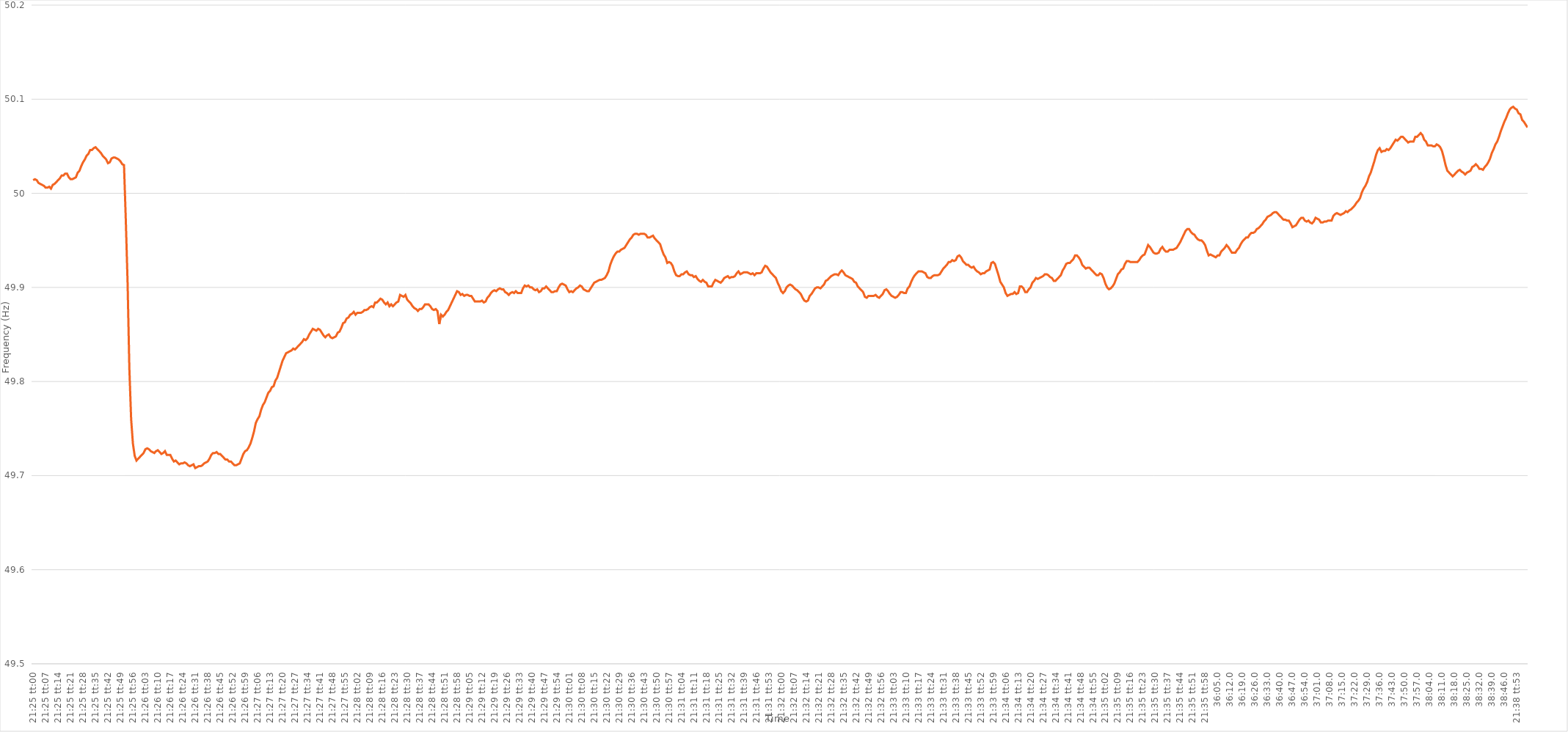
| Category | Series 0 |
|---|---|
| 0.8923611111111112 | 50.014 |
| 0.8923726851851851 | 50.015 |
| 0.8923842592592592 | 50.014 |
| 0.8923958333333334 | 50.011 |
| 0.8924074074074074 | 50.01 |
| 0.8924189814814815 | 50.009 |
| 0.8924305555555555 | 50.008 |
| 0.8924421296296297 | 50.006 |
| 0.8924537037037038 | 50.006 |
| 0.8924652777777777 | 50.007 |
| 0.8924768518518519 | 50.005 |
| 0.8924884259259259 | 50.009 |
| 0.8925000000000001 | 50.01 |
| 0.892511574074074 | 50.012 |
| 0.8925231481481481 | 50.014 |
| 0.8925347222222223 | 50.016 |
| 0.8925462962962962 | 50.019 |
| 0.8925578703703704 | 50.019 |
| 0.8925694444444444 | 50.021 |
| 0.8925810185185186 | 50.021 |
| 0.8925925925925925 | 50.017 |
| 0.8926041666666666 | 50.015 |
| 0.8926157407407408 | 50.015 |
| 0.8926273148148148 | 50.016 |
| 0.8926388888888889 | 50.017 |
| 0.8926504629629629 | 50.022 |
| 0.8926620370370371 | 50.024 |
| 0.8926736111111112 | 50.029 |
| 0.8926851851851851 | 50.033 |
| 0.8926967592592593 | 50.036 |
| 0.8927083333333333 | 50.04 |
| 0.8927199074074075 | 50.042 |
| 0.8927314814814814 | 50.046 |
| 0.8927430555555556 | 50.046 |
| 0.8927546296296297 | 50.048 |
| 0.8927662037037036 | 50.049 |
| 0.8927777777777778 | 50.047 |
| 0.8927893518518518 | 50.045 |
| 0.892800925925926 | 50.043 |
| 0.8928124999999999 | 50.04 |
| 0.892824074074074 | 50.038 |
| 0.8928356481481482 | 50.036 |
| 0.8928472222222222 | 50.032 |
| 0.8928587962962963 | 50.033 |
| 0.8928703703703703 | 50.037 |
| 0.8928819444444445 | 50.038 |
| 0.8928935185185186 | 50.038 |
| 0.8929050925925925 | 50.037 |
| 0.8929166666666667 | 50.036 |
| 0.8929282407407407 | 50.034 |
| 0.8929398148148149 | 50.031 |
| 0.8929513888888888 | 50.03 |
| 0.892962962962963 | 49.972 |
| 0.8929745370370371 | 49.906 |
| 0.892986111111111 | 49.814 |
| 0.8929976851851852 | 49.76 |
| 0.8930092592592592 | 49.734 |
| 0.8930208333333334 | 49.721 |
| 0.8930324074074073 | 49.716 |
| 0.8930439814814815 | 49.718 |
| 0.8930555555555556 | 49.72 |
| 0.8930671296296296 | 49.722 |
| 0.8930787037037037 | 49.724 |
| 0.8930902777777777 | 49.728 |
| 0.8931018518518519 | 49.729 |
| 0.893113425925926 | 49.728 |
| 0.893125 | 49.726 |
| 0.8931365740740741 | 49.725 |
| 0.8931481481481481 | 49.724 |
| 0.8931597222222223 | 49.726 |
| 0.8931712962962962 | 49.727 |
| 0.8931828703703704 | 49.725 |
| 0.8931944444444445 | 49.723 |
| 0.8932060185185186 | 49.724 |
| 0.8932175925925926 | 49.726 |
| 0.8932291666666666 | 49.722 |
| 0.8932407407407408 | 49.722 |
| 0.8932523148148147 | 49.722 |
| 0.8932638888888889 | 49.718 |
| 0.893275462962963 | 49.715 |
| 0.893287037037037 | 49.716 |
| 0.8932986111111111 | 49.714 |
| 0.8933101851851851 | 49.712 |
| 0.8933217592592593 | 49.713 |
| 0.8933333333333334 | 49.713 |
| 0.8933449074074074 | 49.714 |
| 0.8933564814814815 | 49.713 |
| 0.8933680555555555 | 49.711 |
| 0.8933796296296297 | 49.71 |
| 0.8933912037037036 | 49.711 |
| 0.8934027777777778 | 49.712 |
| 0.8934143518518519 | 49.708 |
| 0.893425925925926 | 49.709 |
| 0.8934375 | 49.71 |
| 0.893449074074074 | 49.71 |
| 0.8934606481481482 | 49.711 |
| 0.8934722222222223 | 49.713 |
| 0.8934837962962963 | 49.714 |
| 0.8934953703703704 | 49.715 |
| 0.8935069444444445 | 49.718 |
| 0.8935185185185185 | 49.722 |
| 0.8935300925925925 | 49.724 |
| 0.8935416666666667 | 49.724 |
| 0.8935532407407408 | 49.725 |
| 0.8935648148148148 | 49.723 |
| 0.8935763888888889 | 49.723 |
| 0.893587962962963 | 49.721 |
| 0.8935995370370371 | 49.719 |
| 0.893611111111111 | 49.717 |
| 0.8936226851851852 | 49.717 |
| 0.8936342592592593 | 49.715 |
| 0.8936458333333334 | 49.715 |
| 0.8936574074074074 | 49.713 |
| 0.8936689814814814 | 49.711 |
| 0.8936805555555556 | 49.711 |
| 0.8936921296296297 | 49.712 |
| 0.8937037037037037 | 49.713 |
| 0.8937152777777778 | 49.718 |
| 0.8937268518518519 | 49.723 |
| 0.8937384259259259 | 49.726 |
| 0.8937499999999999 | 49.727 |
| 0.8937615740740741 | 49.73 |
| 0.8937731481481482 | 49.734 |
| 0.8937847222222222 | 49.74 |
| 0.8937962962962963 | 49.747 |
| 0.8938078703703703 | 49.756 |
| 0.8938194444444445 | 49.76 |
| 0.8938310185185184 | 49.763 |
| 0.8938425925925926 | 49.77 |
| 0.8938541666666667 | 49.775 |
| 0.8938657407407408 | 49.778 |
| 0.8938773148148148 | 49.783 |
| 0.8938888888888888 | 49.788 |
| 0.893900462962963 | 49.79 |
| 0.8939120370370371 | 49.794 |
| 0.8939236111111111 | 49.795 |
| 0.8939351851851852 | 49.801 |
| 0.8939467592592593 | 49.804 |
| 0.8939583333333333 | 49.81 |
| 0.8939699074074073 | 49.816 |
| 0.8939814814814815 | 49.822 |
| 0.8939930555555556 | 49.826 |
| 0.8940046296296296 | 49.83 |
| 0.8940162037037037 | 49.831 |
| 0.8940277777777778 | 49.832 |
| 0.8940393518518519 | 49.833 |
| 0.8940509259259258 | 49.835 |
| 0.8940625 | 49.834 |
| 0.8940740740740741 | 49.836 |
| 0.8940856481481482 | 49.838 |
| 0.8940972222222222 | 49.84 |
| 0.8941087962962962 | 49.842 |
| 0.8941203703703704 | 49.845 |
| 0.8941319444444445 | 49.844 |
| 0.8941435185185185 | 49.846 |
| 0.8941550925925926 | 49.85 |
| 0.8941666666666667 | 49.853 |
| 0.8941782407407407 | 49.856 |
| 0.8941898148148147 | 49.855 |
| 0.8942013888888889 | 49.854 |
| 0.894212962962963 | 49.856 |
| 0.894224537037037 | 49.855 |
| 0.8942361111111111 | 49.852 |
| 0.8942476851851852 | 49.849 |
| 0.8942592592592593 | 49.847 |
| 0.8942708333333332 | 49.849 |
| 0.8942824074074074 | 49.85 |
| 0.8942939814814815 | 49.847 |
| 0.8943055555555556 | 49.846 |
| 0.8943171296296296 | 49.847 |
| 0.8943287037037037 | 49.848 |
| 0.8943402777777778 | 49.852 |
| 0.894351851851852 | 49.853 |
| 0.8943634259259259 | 49.857 |
| 0.894375 | 49.862 |
| 0.8943865740740741 | 49.863 |
| 0.8943981481481482 | 49.867 |
| 0.8944097222222221 | 49.868 |
| 0.8944212962962963 | 49.871 |
| 0.8944328703703704 | 49.872 |
| 0.8944444444444444 | 49.874 |
| 0.8944560185185185 | 49.871 |
| 0.8944675925925926 | 49.873 |
| 0.8944791666666667 | 49.873 |
| 0.8944907407407406 | 49.873 |
| 0.8945023148148148 | 49.874 |
| 0.8945138888888889 | 49.876 |
| 0.894525462962963 | 49.876 |
| 0.894537037037037 | 49.877 |
| 0.8945486111111111 | 49.879 |
| 0.8945601851851852 | 49.88 |
| 0.8945717592592594 | 49.879 |
| 0.8945833333333333 | 49.884 |
| 0.8945949074074074 | 49.884 |
| 0.8946064814814815 | 49.886 |
| 0.8946180555555556 | 49.888 |
| 0.8946296296296296 | 49.887 |
| 0.8946412037037037 | 49.884 |
| 0.8946527777777779 | 49.882 |
| 0.8946643518518518 | 49.884 |
| 0.8946759259259259 | 49.88 |
| 0.8946875 | 49.882 |
| 0.8946990740740741 | 49.88 |
| 0.894710648148148 | 49.882 |
| 0.8947222222222222 | 49.884 |
| 0.8947337962962963 | 49.885 |
| 0.8947453703703704 | 49.892 |
| 0.8947569444444444 | 49.891 |
| 0.8947685185185185 | 49.89 |
| 0.8947800925925926 | 49.892 |
| 0.8947916666666668 | 49.887 |
| 0.8948032407407407 | 49.885 |
| 0.8948148148148148 | 49.883 |
| 0.8948263888888889 | 49.88 |
| 0.894837962962963 | 49.878 |
| 0.894849537037037 | 49.877 |
| 0.8948611111111111 | 49.875 |
| 0.8948726851851853 | 49.877 |
| 0.8948842592592593 | 49.877 |
| 0.8948958333333333 | 49.879 |
| 0.8949074074074074 | 49.882 |
| 0.8949189814814815 | 49.882 |
| 0.8949305555555555 | 49.882 |
| 0.8949421296296296 | 49.88 |
| 0.8949537037037038 | 49.877 |
| 0.8949652777777778 | 49.876 |
| 0.8949768518518518 | 49.877 |
| 0.8949884259259259 | 49.875 |
| 0.895 | 49.861 |
| 0.8950115740740742 | 49.871 |
| 0.8950231481481481 | 49.869 |
| 0.8950347222222222 | 49.871 |
| 0.8950462962962963 | 49.874 |
| 0.8950578703703704 | 49.876 |
| 0.8950694444444444 | 49.88 |
| 0.8950810185185185 | 49.884 |
| 0.8950925925925927 | 49.888 |
| 0.8951041666666667 | 49.892 |
| 0.8951157407407407 | 49.896 |
| 0.8951273148148148 | 49.895 |
| 0.8951388888888889 | 49.892 |
| 0.8951504629629629 | 49.893 |
| 0.895162037037037 | 49.891 |
| 0.8951736111111112 | 49.892 |
| 0.8951851851851852 | 49.892 |
| 0.8951967592592592 | 49.891 |
| 0.8952083333333333 | 49.891 |
| 0.8952199074074074 | 49.888 |
| 0.8952314814814816 | 49.885 |
| 0.8952430555555555 | 49.885 |
| 0.8952546296296297 | 49.885 |
| 0.8952662037037037 | 49.885 |
| 0.8952777777777778 | 49.886 |
| 0.8952893518518518 | 49.884 |
| 0.8953009259259259 | 49.885 |
| 0.8953125000000001 | 49.889 |
| 0.8953240740740741 | 49.891 |
| 0.8953356481481481 | 49.894 |
| 0.8953472222222222 | 49.896 |
| 0.8953587962962963 | 49.897 |
| 0.8953703703703703 | 49.896 |
| 0.8953819444444444 | 49.898 |
| 0.8953935185185186 | 49.899 |
| 0.8954050925925926 | 49.898 |
| 0.8954166666666666 | 49.898 |
| 0.8954282407407407 | 49.895 |
| 0.8954398148148148 | 49.894 |
| 0.895451388888889 | 49.892 |
| 0.8954629629629629 | 49.894 |
| 0.895474537037037 | 49.895 |
| 0.8954861111111111 | 49.894 |
| 0.8954976851851852 | 49.896 |
| 0.8955092592592592 | 49.894 |
| 0.8955208333333333 | 49.894 |
| 0.8955324074074075 | 49.894 |
| 0.8955439814814815 | 49.899 |
| 0.8955555555555555 | 49.902 |
| 0.8955671296296296 | 49.901 |
| 0.8955787037037037 | 49.902 |
| 0.8955902777777777 | 49.9 |
| 0.8956018518518518 | 49.9 |
| 0.895613425925926 | 49.898 |
| 0.895625 | 49.897 |
| 0.895636574074074 | 49.898 |
| 0.8956481481481481 | 49.895 |
| 0.8956597222222222 | 49.896 |
| 0.8956712962962964 | 49.899 |
| 0.8956828703703703 | 49.899 |
| 0.8956944444444445 | 49.901 |
| 0.8957060185185185 | 49.899 |
| 0.8957175925925926 | 49.897 |
| 0.8957291666666666 | 49.895 |
| 0.8957407407407407 | 49.895 |
| 0.8957523148148149 | 49.896 |
| 0.8957638888888889 | 49.896 |
| 0.895775462962963 | 49.9 |
| 0.895787037037037 | 49.903 |
| 0.8957986111111111 | 49.904 |
| 0.8958101851851853 | 49.903 |
| 0.8958217592592592 | 49.902 |
| 0.8958333333333334 | 49.898 |
| 0.8958449074074074 | 49.895 |
| 0.8958564814814814 | 49.896 |
| 0.8958680555555555 | 49.895 |
| 0.8958796296296296 | 49.897 |
| 0.8958912037037038 | 49.899 |
| 0.8959027777777777 | 49.9 |
| 0.8959143518518519 | 49.902 |
| 0.8959259259259259 | 49.901 |
| 0.8959375 | 49.898 |
| 0.895949074074074 | 49.897 |
| 0.8959606481481481 | 49.896 |
| 0.8959722222222223 | 49.896 |
| 0.8959837962962963 | 49.899 |
| 0.8959953703703704 | 49.902 |
| 0.8960069444444444 | 49.905 |
| 0.8960185185185185 | 49.906 |
| 0.8960300925925927 | 49.907 |
| 0.8960416666666666 | 49.908 |
| 0.8960532407407408 | 49.908 |
| 0.8960648148148148 | 49.909 |
| 0.896076388888889 | 49.91 |
| 0.8960879629629629 | 49.913 |
| 0.896099537037037 | 49.917 |
| 0.8961111111111112 | 49.924 |
| 0.8961226851851851 | 49.929 |
| 0.8961342592592593 | 49.933 |
| 0.8961458333333333 | 49.936 |
| 0.8961574074074075 | 49.938 |
| 0.8961689814814814 | 49.938 |
| 0.8961805555555555 | 49.94 |
| 0.8961921296296297 | 49.941 |
| 0.8962037037037037 | 49.942 |
| 0.8962152777777778 | 49.945 |
| 0.8962268518518518 | 49.948 |
| 0.896238425925926 | 49.951 |
| 0.8962500000000001 | 49.953 |
| 0.896261574074074 | 49.956 |
| 0.8962731481481482 | 49.957 |
| 0.8962847222222222 | 49.957 |
| 0.8962962962962964 | 49.956 |
| 0.8963078703703703 | 49.957 |
| 0.8963194444444444 | 49.957 |
| 0.8963310185185186 | 49.957 |
| 0.8963425925925925 | 49.956 |
| 0.8963541666666667 | 49.953 |
| 0.8963657407407407 | 49.953 |
| 0.8963773148148149 | 49.954 |
| 0.8963888888888888 | 49.955 |
| 0.8964004629629629 | 49.952 |
| 0.8964120370370371 | 49.95 |
| 0.8964236111111111 | 49.948 |
| 0.8964351851851852 | 49.946 |
| 0.8964467592592592 | 49.94 |
| 0.8964583333333334 | 49.935 |
| 0.8964699074074075 | 49.932 |
| 0.8964814814814814 | 49.926 |
| 0.8964930555555556 | 49.927 |
| 0.8965046296296296 | 49.926 |
| 0.8965162037037038 | 49.923 |
| 0.8965277777777777 | 49.917 |
| 0.8965393518518519 | 49.913 |
| 0.896550925925926 | 49.912 |
| 0.8965624999999999 | 49.912 |
| 0.8965740740740741 | 49.914 |
| 0.8965856481481481 | 49.914 |
| 0.8965972222222223 | 49.916 |
| 0.8966087962962962 | 49.917 |
| 0.8966203703703703 | 49.914 |
| 0.8966319444444445 | 49.913 |
| 0.8966435185185185 | 49.913 |
| 0.8966550925925926 | 49.911 |
| 0.8966666666666666 | 49.912 |
| 0.8966782407407408 | 49.909 |
| 0.8966898148148149 | 49.907 |
| 0.8967013888888888 | 49.906 |
| 0.896712962962963 | 49.908 |
| 0.896724537037037 | 49.906 |
| 0.8967361111111112 | 49.905 |
| 0.8967476851851851 | 49.901 |
| 0.8967592592592593 | 49.901 |
| 0.8967708333333334 | 49.901 |
| 0.8967824074074073 | 49.905 |
| 0.8967939814814815 | 49.908 |
| 0.8968055555555555 | 49.907 |
| 0.8968171296296297 | 49.906 |
| 0.8968287037037036 | 49.905 |
| 0.8968402777777778 | 49.907 |
| 0.8968518518518519 | 49.91 |
| 0.8968634259259259 | 49.911 |
| 0.896875 | 49.912 |
| 0.896886574074074 | 49.91 |
| 0.8968981481481482 | 49.911 |
| 0.8969097222222223 | 49.911 |
| 0.8969212962962962 | 49.912 |
| 0.8969328703703704 | 49.915 |
| 0.8969444444444444 | 49.917 |
| 0.8969560185185186 | 49.914 |
| 0.8969675925925925 | 49.915 |
| 0.8969791666666667 | 49.916 |
| 0.8969907407407408 | 49.916 |
| 0.8970023148148148 | 49.916 |
| 0.8970138888888889 | 49.915 |
| 0.8970254629629629 | 49.914 |
| 0.8970370370370371 | 49.915 |
| 0.897048611111111 | 49.913 |
| 0.8970601851851852 | 49.915 |
| 0.8970717592592593 | 49.915 |
| 0.8970833333333333 | 49.915 |
| 0.8970949074074074 | 49.916 |
| 0.8971064814814814 | 49.92 |
| 0.8971180555555556 | 49.923 |
| 0.8971296296296297 | 49.922 |
| 0.8971412037037036 | 49.919 |
| 0.8971527777777778 | 49.916 |
| 0.8971643518518518 | 49.914 |
| 0.897175925925926 | 49.912 |
| 0.8971874999999999 | 49.91 |
| 0.8971990740740741 | 49.905 |
| 0.8972106481481482 | 49.901 |
| 0.8972222222222223 | 49.896 |
| 0.8972337962962963 | 49.894 |
| 0.8972453703703703 | 49.896 |
| 0.8972569444444445 | 49.9 |
| 0.8972685185185186 | 49.902 |
| 0.8972800925925926 | 49.903 |
| 0.8972916666666667 | 49.902 |
| 0.8973032407407407 | 49.9 |
| 0.8973148148148148 | 49.898 |
| 0.8973263888888888 | 49.897 |
| 0.897337962962963 | 49.895 |
| 0.8973495370370371 | 49.893 |
| 0.897361111111111 | 49.889 |
| 0.8973726851851852 | 49.886 |
| 0.8973842592592592 | 49.885 |
| 0.8973958333333334 | 49.886 |
| 0.8974074074074073 | 49.891 |
| 0.8974189814814815 | 49.893 |
| 0.8974305555555556 | 49.896 |
| 0.8974421296296297 | 49.899 |
| 0.8974537037037037 | 49.9 |
| 0.8974652777777777 | 49.9 |
| 0.8974768518518519 | 49.899 |
| 0.897488425925926 | 49.901 |
| 0.8975 | 49.903 |
| 0.8975115740740741 | 49.907 |
| 0.8975231481481482 | 49.908 |
| 0.8975347222222222 | 49.91 |
| 0.8975462962962962 | 49.912 |
| 0.8975578703703704 | 49.913 |
| 0.8975694444444445 | 49.914 |
| 0.8975810185185185 | 49.914 |
| 0.8975925925925926 | 49.913 |
| 0.8976041666666666 | 49.916 |
| 0.8976157407407408 | 49.918 |
| 0.8976273148148147 | 49.916 |
| 0.8976388888888889 | 49.913 |
| 0.897650462962963 | 49.912 |
| 0.8976620370370371 | 49.911 |
| 0.8976736111111111 | 49.91 |
| 0.8976851851851851 | 49.909 |
| 0.8976967592592593 | 49.906 |
| 0.8977083333333334 | 49.905 |
| 0.8977199074074074 | 49.901 |
| 0.8977314814814815 | 49.899 |
| 0.8977430555555556 | 49.897 |
| 0.8977546296296296 | 49.895 |
| 0.8977662037037036 | 49.89 |
| 0.8977777777777778 | 49.889 |
| 0.8977893518518519 | 49.891 |
| 0.8978009259259259 | 49.891 |
| 0.8978125 | 49.891 |
| 0.897824074074074 | 49.891 |
| 0.8978356481481482 | 49.892 |
| 0.8978472222222221 | 49.89 |
| 0.8978587962962963 | 49.889 |
| 0.8978703703703704 | 49.891 |
| 0.8978819444444445 | 49.893 |
| 0.8978935185185185 | 49.897 |
| 0.8979050925925925 | 49.898 |
| 0.8979166666666667 | 49.896 |
| 0.8979282407407408 | 49.893 |
| 0.8979398148148148 | 49.891 |
| 0.8979513888888889 | 49.89 |
| 0.897962962962963 | 49.889 |
| 0.897974537037037 | 49.89 |
| 0.897986111111111 | 49.892 |
| 0.8979976851851852 | 49.895 |
| 0.8980092592592593 | 49.895 |
| 0.8980208333333333 | 49.894 |
| 0.8980324074074074 | 49.894 |
| 0.8980439814814815 | 49.899 |
| 0.8980555555555556 | 49.901 |
| 0.8980671296296295 | 49.906 |
| 0.8980787037037037 | 49.91 |
| 0.8980902777777778 | 49.913 |
| 0.8981018518518519 | 49.915 |
| 0.8981134259259259 | 49.917 |
| 0.898125 | 49.917 |
| 0.8981365740740741 | 49.917 |
| 0.8981481481481483 | 49.916 |
| 0.8981597222222222 | 49.915 |
| 0.8981712962962963 | 49.911 |
| 0.8981828703703704 | 49.91 |
| 0.8981944444444444 | 49.91 |
| 0.8982060185185184 | 49.912 |
| 0.8982175925925926 | 49.913 |
| 0.8982291666666667 | 49.913 |
| 0.8982407407407407 | 49.913 |
| 0.8982523148148148 | 49.914 |
| 0.8982638888888889 | 49.917 |
| 0.898275462962963 | 49.92 |
| 0.8982870370370369 | 49.922 |
| 0.8982986111111111 | 49.924 |
| 0.8983101851851852 | 49.927 |
| 0.8983217592592593 | 49.927 |
| 0.8983333333333333 | 49.929 |
| 0.8983449074074074 | 49.928 |
| 0.8983564814814815 | 49.929 |
| 0.8983680555555557 | 49.933 |
| 0.8983796296296296 | 49.934 |
| 0.8983912037037037 | 49.932 |
| 0.8984027777777778 | 49.928 |
| 0.8984143518518519 | 49.926 |
| 0.8984259259259259 | 49.924 |
| 0.8984375 | 49.924 |
| 0.8984490740740741 | 49.922 |
| 0.8984606481481481 | 49.921 |
| 0.8984722222222222 | 49.922 |
| 0.8984837962962963 | 49.919 |
| 0.8984953703703704 | 49.917 |
| 0.8985069444444443 | 49.916 |
| 0.8985185185185185 | 49.914 |
| 0.8985300925925926 | 49.915 |
| 0.8985416666666667 | 49.915 |
| 0.8985532407407407 | 49.917 |
| 0.8985648148148148 | 49.918 |
| 0.8985763888888889 | 49.919 |
| 0.8985879629629631 | 49.926 |
| 0.898599537037037 | 49.927 |
| 0.8986111111111111 | 49.925 |
| 0.8986226851851852 | 49.919 |
| 0.8986342592592593 | 49.913 |
| 0.8986458333333333 | 49.906 |
| 0.8986574074074074 | 49.903 |
| 0.8986689814814816 | 49.9 |
| 0.8986805555555556 | 49.894 |
| 0.8986921296296296 | 49.891 |
| 0.8987037037037037 | 49.892 |
| 0.8987152777777778 | 49.893 |
| 0.8987268518518517 | 49.893 |
| 0.8987384259259259 | 49.895 |
| 0.89875 | 49.893 |
| 0.8987615740740741 | 49.894 |
| 0.8987731481481481 | 49.901 |
| 0.8987847222222222 | 49.901 |
| 0.8987962962962963 | 49.899 |
| 0.8988078703703705 | 49.895 |
| 0.8988194444444444 | 49.895 |
| 0.8988310185185185 | 49.898 |
| 0.8988425925925926 | 49.9 |
| 0.8988541666666667 | 49.905 |
| 0.8988657407407407 | 49.907 |
| 0.8988773148148148 | 49.91 |
| 0.898888888888889 | 49.909 |
| 0.898900462962963 | 49.91 |
| 0.898912037037037 | 49.911 |
| 0.8989236111111111 | 49.912 |
| 0.8989351851851852 | 49.914 |
| 0.8989467592592592 | 49.914 |
| 0.8989583333333333 | 49.913 |
| 0.8989699074074075 | 49.911 |
| 0.8989814814814815 | 49.91 |
| 0.8989930555555555 | 49.907 |
| 0.8990046296296296 | 49.907 |
| 0.8990162037037037 | 49.909 |
| 0.8990277777777779 | 49.911 |
| 0.8990393518518518 | 49.913 |
| 0.899050925925926 | 49.918 |
| 0.8990625 | 49.921 |
| 0.8990740740740741 | 49.925 |
| 0.8990856481481481 | 49.926 |
| 0.8990972222222222 | 49.926 |
| 0.8991087962962964 | 49.928 |
| 0.8991203703703704 | 49.93 |
| 0.8991319444444444 | 49.934 |
| 0.8991435185185185 | 49.934 |
| 0.8991550925925926 | 49.932 |
| 0.8991666666666666 | 49.929 |
| 0.8991782407407407 | 49.924 |
| 0.8991898148148149 | 49.922 |
| 0.8992013888888889 | 49.92 |
| 0.8992129629629629 | 49.921 |
| 0.899224537037037 | 49.921 |
| 0.8992361111111111 | 49.919 |
| 0.8992476851851853 | 49.917 |
| 0.8992592592592592 | 49.915 |
| 0.8992708333333334 | 49.913 |
| 0.8992824074074074 | 49.913 |
| 0.8992939814814815 | 49.915 |
| 0.8993055555555555 | 49.914 |
| 0.8993171296296296 | 49.91 |
| 0.8993287037037038 | 49.904 |
| 0.8993402777777778 | 49.9 |
| 0.8993518518518518 | 49.898 |
| 0.8993634259259259 | 49.899 |
| 0.899375 | 49.901 |
| 0.899386574074074 | 49.904 |
| 0.8993981481481481 | 49.909 |
| 0.8994097222222223 | 49.914 |
| 0.8994212962962963 | 49.916 |
| 0.8994328703703703 | 49.919 |
| 0.8994444444444444 | 49.92 |
| 0.8994560185185185 | 49.925 |
| 0.8994675925925927 | 49.928 |
| 0.8994791666666666 | 49.928 |
| 0.8994907407407408 | 49.927 |
| 0.8995023148148148 | 49.927 |
| 0.899513888888889 | 49.927 |
| 0.8995254629629629 | 49.927 |
| 0.899537037037037 | 49.927 |
| 0.8995486111111112 | 49.929 |
| 0.8995601851851852 | 49.932 |
| 0.8995717592592593 | 49.934 |
| 0.8995833333333333 | 49.935 |
| 0.8995949074074074 | 49.94 |
| 0.8996064814814814 | 49.945 |
| 0.8996180555555555 | 49.943 |
| 0.8996296296296297 | 49.94 |
| 0.8996412037037037 | 49.937 |
| 0.8996527777777777 | 49.936 |
| 0.8996643518518518 | 49.936 |
| 0.8996759259259259 | 49.937 |
| 0.8996875000000001 | 49.941 |
| 0.899699074074074 | 49.943 |
| 0.8997106481481482 | 49.94 |
| 0.8997222222222222 | 49.938 |
| 0.8997337962962964 | 49.938 |
| 0.8997453703703703 | 49.94 |
| 0.8997569444444444 | 49.94 |
| 0.8997685185185186 | 49.94 |
| 0.8997800925925926 | 49.941 |
| 0.8997916666666667 | 49.942 |
| 0.8998032407407407 | 49.945 |
| 0.8998148148148148 | 49.948 |
| 0.899826388888889 | 49.952 |
| 0.8998379629629629 | 49.956 |
| 0.8998495370370371 | 49.96 |
| 0.8998611111111111 | 49.962 |
| 0.8998726851851853 | 49.962 |
| 0.8998842592592592 | 49.959 |
| 0.8998958333333333 | 49.957 |
| 0.8999074074074075 | 49.956 |
| 0.8999189814814814 | 49.953 |
| 0.8999305555555556 | 49.951 |
| 0.8999421296296296 | 49.95 |
| 0.8999537037037038 | 49.95 |
| 0.8999652777777777 | 49.948 |
| 0.8999768518518518 | 49.945 |
| 0.899988425925926 | 49.939 |
| 0.9 | 49.934 |
| 0.9000115740740741 | 49.935 |
| 0.9000231481481481 | 49.934 |
| 0.9000347222222222 | 49.933 |
| 0.9000462962962964 | 49.932 |
| 0.9000578703703703 | 49.934 |
| 0.9000694444444445 | 49.934 |
| 0.9000810185185185 | 49.938 |
| 0.9000925925925927 | 49.94 |
| 0.9001041666666666 | 49.942 |
| 0.9001157407407407 | 49.945 |
| 0.9001273148148149 | 49.943 |
| 0.9001388888888888 | 49.94 |
| 0.900150462962963 | 49.937 |
| 0.900162037037037 | 49.937 |
| 0.9001736111111112 | 49.937 |
| 0.9001851851851851 | 49.94 |
| 0.9001967592592592 | 49.942 |
| 0.9002083333333334 | 49.946 |
| 0.9002199074074074 | 49.949 |
| 0.9002314814814815 | 49.951 |
| 0.9002430555555555 | 49.953 |
| 0.9002546296296297 | 49.953 |
| 0.9002662037037038 | 49.956 |
| 0.9002777777777777 | 49.958 |
| 0.9002893518518519 | 49.958 |
| 0.9003009259259259 | 49.959 |
| 0.9003125000000001 | 49.962 |
| 0.900324074074074 | 49.963 |
| 0.9003356481481481 | 49.965 |
| 0.9003472222222223 | 49.967 |
| 0.9003587962962962 | 49.97 |
| 0.9003703703703704 | 49.972 |
| 0.9003819444444444 | 49.975 |
| 0.9003935185185186 | 49.976 |
| 0.9004050925925925 | 49.977 |
| 0.9004166666666666 | 49.979 |
| 0.9004282407407408 | 49.98 |
| 0.9004398148148148 | 49.98 |
| 0.9004513888888889 | 49.978 |
| 0.9004629629629629 | 49.976 |
| 0.9004745370370371 | 49.974 |
| 0.9004861111111112 | 49.972 |
| 0.9004976851851851 | 49.972 |
| 0.9005092592592593 | 49.971 |
| 0.9005208333333333 | 49.971 |
| 0.9005324074074075 | 49.968 |
| 0.9005439814814814 | 49.964 |
| 0.9005555555555556 | 49.965 |
| 0.9005671296296297 | 49.966 |
| 0.9005787037037036 | 49.969 |
| 0.9005902777777778 | 49.972 |
| 0.9006018518518518 | 49.974 |
| 0.900613425925926 | 49.974 |
| 0.9006249999999999 | 49.971 |
| 0.900636574074074 | 49.97 |
| 0.9006481481481482 | 49.971 |
| 0.9006597222222222 | 49.969 |
| 0.9006712962962963 | 49.968 |
| 0.9006828703703703 | 49.97 |
| 0.9006944444444445 | 49.974 |
| 0.9007060185185186 | 49.973 |
| 0.9007175925925925 | 49.972 |
| 0.9007291666666667 | 49.969 |
| 0.9007407407407407 | 49.969 |
| 0.9007523148148149 | 49.97 |
| 0.9007638888888888 | 49.97 |
| 0.900775462962963 | 49.971 |
| 0.9007870370370371 | 49.971 |
| 0.900798611111111 | 49.971 |
| 0.9008101851851852 | 49.976 |
| 0.9008217592592592 | 49.978 |
| 0.9008333333333334 | 49.979 |
| 0.9008449074074073 | 49.978 |
| 0.9008564814814815 | 49.977 |
| 0.9008680555555556 | 49.978 |
| 0.9008796296296296 | 49.979 |
| 0.9008912037037037 | 49.981 |
| 0.9009027777777777 | 49.98 |
| 0.9009143518518519 | 49.982 |
| 0.900925925925926 | 49.983 |
| 0.9009375 | 49.985 |
| 0.9009490740740741 | 49.987 |
| 0.9009606481481481 | 49.99 |
| 0.9009722222222223 | 49.992 |
| 0.9009837962962962 | 49.995 |
| 0.9009953703703704 | 50.001 |
| 0.9010069444444445 | 50.005 |
| 0.9010185185185186 | 50.008 |
| 0.9010300925925926 | 50.012 |
| 0.9010416666666666 | 50.018 |
| 0.9010532407407408 | 50.022 |
| 0.9010648148148147 | 50.028 |
| 0.9010763888888889 | 50.034 |
| 0.901087962962963 | 50.041 |
| 0.901099537037037 | 50.046 |
| 0.9011111111111111 | 50.048 |
| 0.9011226851851851 | 50.044 |
| 0.9011342592592593 | 50.045 |
| 0.9011458333333334 | 50.045 |
| 0.9011574074074074 | 50.047 |
| 0.9011689814814815 | 50.046 |
| 0.9011805555555555 | 50.048 |
| 0.9011921296296297 | 50.051 |
| 0.9012037037037036 | 50.054 |
| 0.9012152777777778 | 50.057 |
| 0.9012268518518519 | 50.056 |
| 0.901238425925926 | 50.058 |
| 0.90125 | 50.06 |
| 0.901261574074074 | 50.06 |
| 0.9012731481481482 | 50.058 |
| 0.9012847222222223 | 50.056 |
| 0.9012962962962963 | 50.054 |
| 0.9013078703703704 | 50.055 |
| 0.9013194444444445 | 50.055 |
| 0.9013310185185185 | 50.055 |
| 0.9013425925925925 | 50.06 |
| 0.9013541666666667 | 50.06 |
| 0.9013657407407408 | 50.062 |
| 0.9013773148148148 | 50.064 |
| 0.9013888888888889 | 50.062 |
| 0.901400462962963 | 50.057 |
| 0.9014120370370371 | 50.055 |
| 0.901423611111111 | 50.051 |
| 0.9014351851851852 | 50.051 |
| 0.9014467592592593 | 50.051 |
| 0.9014583333333334 | 50.05 |
| 0.9014699074074074 | 50.05 |
| 0.9014814814814814 | 50.052 |
| 0.9014930555555556 | 50.051 |
| 0.9015046296296297 | 50.049 |
| 0.9015162037037037 | 50.045 |
| 0.9015277777777778 | 50.038 |
| 0.9015393518518519 | 50.03 |
| 0.9015509259259259 | 50.024 |
| 0.9015624999999999 | 50.022 |
| 0.9015740740740741 | 50.02 |
| 0.9015856481481482 | 50.018 |
| 0.9015972222222222 | 50.02 |
| 0.9016087962962963 | 50.022 |
| 0.9016203703703703 | 50.024 |
| 0.9016319444444445 | 50.025 |
| 0.9016435185185184 | 50.023 |
| 0.9016550925925926 | 50.022 |
| 0.9016666666666667 | 50.02 |
| 0.9016782407407408 | 50.022 |
| 0.9016898148148148 | 50.023 |
| 0.9017013888888888 | 50.024 |
| 0.901712962962963 | 50.028 |
| 0.9017245370370371 | 50.029 |
| 0.9017361111111111 | 50.031 |
| 0.9017476851851852 | 50.029 |
| 0.9017592592592593 | 50.026 |
| 0.9017708333333333 | 50.026 |
| 0.9017824074074073 | 50.025 |
| 0.9017939814814815 | 50.028 |
| 0.9018055555555556 | 50.03 |
| 0.9018171296296296 | 50.033 |
| 0.9018287037037037 | 50.037 |
| 0.9018402777777778 | 50.043 |
| 0.9018518518518519 | 50.047 |
| 0.9018634259259258 | 50.052 |
| 0.901875 | 50.055 |
| 0.9018865740740741 | 50.06 |
| 0.9018981481481482 | 50.066 |
| 0.9019097222222222 | 50.071 |
| 0.9019212962962962 | 50.076 |
| 0.9019328703703704 | 50.08 |
| 0.9019444444444445 | 50.085 |
| 0.9019560185185185 | 50.089 |
| 0.9019675925925926 | 50.091 |
| 0.9019791666666667 | 50.092 |
| 0.9019907407407407 | 50.09 |
| 0.9020023148148147 | 50.089 |
| 0.9020138888888889 | 50.085 |
| 0.902025462962963 | 50.084 |
| 0.902037037037037 | 50.078 |
| 0.9020486111111111 | 50.076 |
| 0.9020601851851852 | 50.073 |
| 0.9020717592592593 | 50.07 |